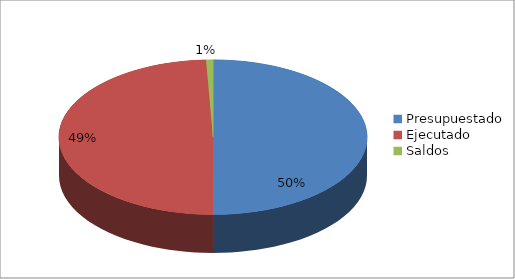
| Category | Series 0 |
|---|---|
| Presupuestado | 21095803458 |
| Ejecutado | 20788822158 |
| Saldos | 304981300 |